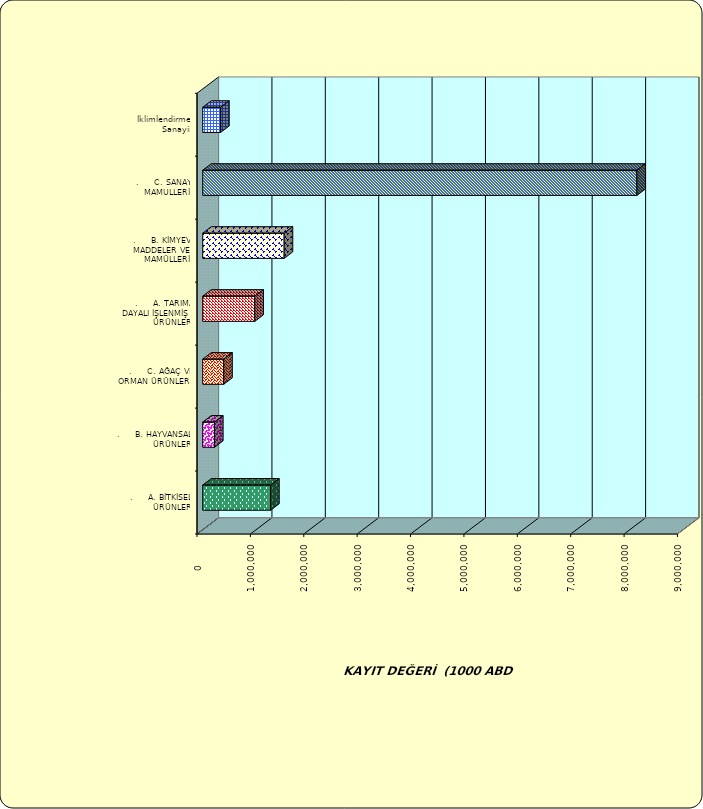
| Category | Series 0 |
|---|---|
| .     A. BİTKİSEL ÜRÜNLER | 1272042.351 |
| .     B. HAYVANSAL ÜRÜNLER | 221139.084 |
| .     C. AĞAÇ VE ORMAN ÜRÜNLERİ | 393522.563 |
| .     A. TARIMA DAYALI İŞLENMİŞ ÜRÜNLER | 976381.69 |
| .     B. KİMYEVİ MADDELER VE MAMÜLLERİ | 1525896.835 |
| .     C. SANAYİ MAMULLERİ | 8133042.155 |
|  İklimlendirme Sanayii | 335473.005 |